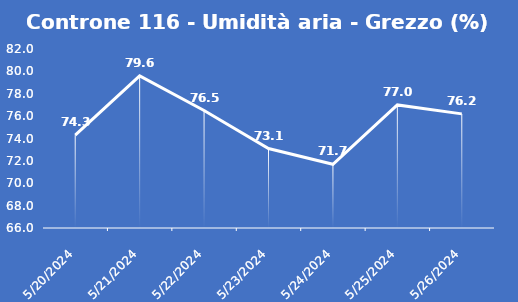
| Category | Controne 116 - Umidità aria - Grezzo (%) |
|---|---|
| 5/20/24 | 74.3 |
| 5/21/24 | 79.6 |
| 5/22/24 | 76.5 |
| 5/23/24 | 73.1 |
| 5/24/24 | 71.7 |
| 5/25/24 | 77 |
| 5/26/24 | 76.2 |